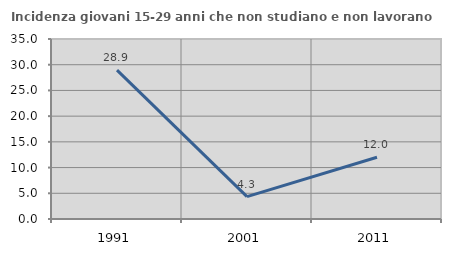
| Category | Incidenza giovani 15-29 anni che non studiano e non lavorano  |
|---|---|
| 1991.0 | 28.947 |
| 2001.0 | 4.348 |
| 2011.0 | 12 |